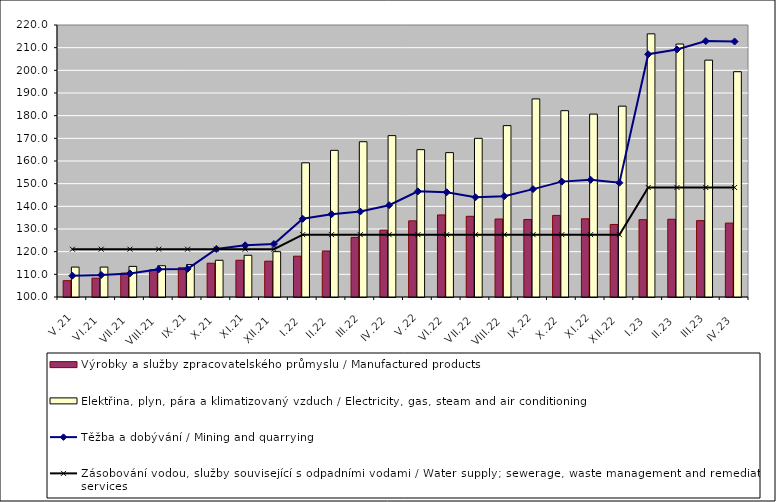
| Category | Výrobky a služby zpracovatelského průmyslu / Manufactured products | Elektřina, plyn, pára a klimatizovaný vzduch / Electricity, gas, steam and air conditioning |
|---|---|---|
| V.21 | 107.2 | 113.2 |
| VI.21 | 108.3 | 113.2 |
| VII.21 | 110.5 | 113.5 |
| VIII.21 | 112 | 113.8 |
| IX.21 | 112.9 | 114.3 |
| X.21 | 114.9 | 116.2 |
| XI.21 | 116.2 | 118.4 |
| XII.21 | 115.8 | 120 |
| I.22 | 118 | 159.2 |
| II.22 | 120.3 | 164.7 |
| III.22 | 126.3 | 168.5 |
| IV.22 | 129.5 | 171.2 |
| V.22 | 133.6 | 165 |
| VI.22 | 136.2 | 163.7 |
| VII.22 | 135.6 | 170 |
| VIII.22 | 134.4 | 175.6 |
| IX.22 | 134.2 | 187.4 |
| X.22 | 136 | 182.2 |
| XI.22 | 134.5 | 180.7 |
| XII.22 | 132 | 184.2 |
| I.23 | 134.1 | 216.1 |
| II.23 | 134.3 | 211.6 |
| III.23 | 133.7 | 204.5 |
| IV.23 | 132.6 | 199.4 |